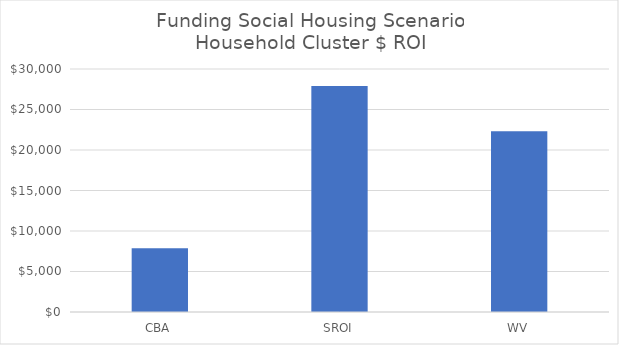
| Category | Household |
|---|---|
| CBA | 7862 |
| SROI | 27903.6 |
| WV | 22304 |